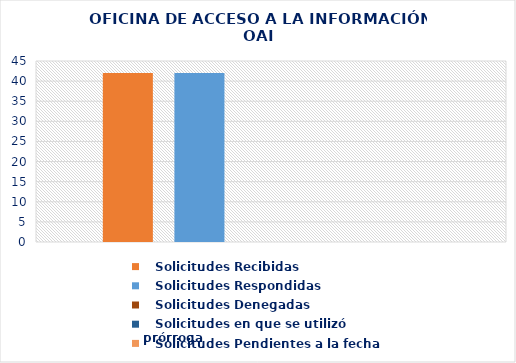
| Category |    Solicitudes Recibidas |    Solicitudes Respondidas |    Solicitudes Denegadas |    Solicitudes en que se utilizó prórroga |    Solicitudes Pendientes a la fecha |
|---|---|---|---|---|---|
| 0 | 42 | 42 | 0 | 0 | 0 |